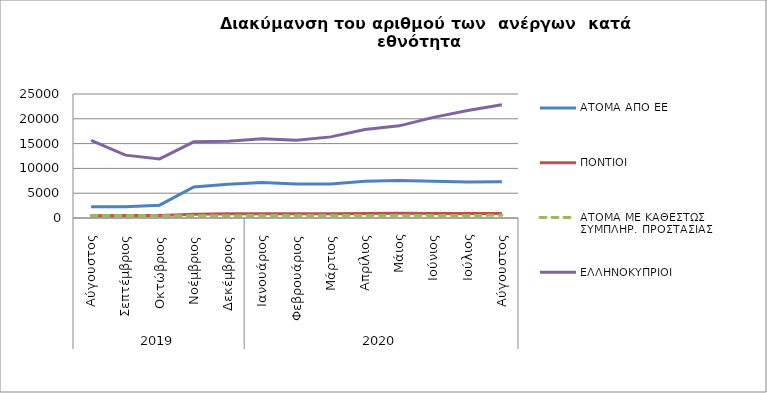
| Category | ΑΤΟΜΑ ΑΠΟ ΕΕ | ΠΟΝΤΙΟΙ | ΑΤΟΜΑ ΜΕ ΚΑΘΕΣΤΩΣ ΣΥΜΠΛΗΡ. ΠΡΟΣΤΑΣΙΑΣ | ΕΛΛΗΝΟΚΥΠΡΙΟΙ |
|---|---|---|---|---|
| 0 | 2278 | 474 | 486 | 15644 |
| 1 | 2278 | 504 | 497 | 12674 |
| 2 | 2586 | 518 | 475 | 11921 |
| 3 | 6266 | 775 | 476 | 15352 |
| 4 | 6810 | 834 | 465 | 15490 |
| 5 | 7137 | 866 | 490 | 15998 |
| 6 | 6870 | 843 | 480 | 15686 |
| 7 | 6874 | 847 | 504 | 16354 |
| 8 | 7404 | 915 | 519 | 17832 |
| 9 | 7574 | 936 | 521 | 18581 |
| 10 | 7420 | 925 | 510 | 20290 |
| 11 | 7235 | 885 | 503 | 21691 |
| 12 | 7285 | 905 | 547 | 22821 |